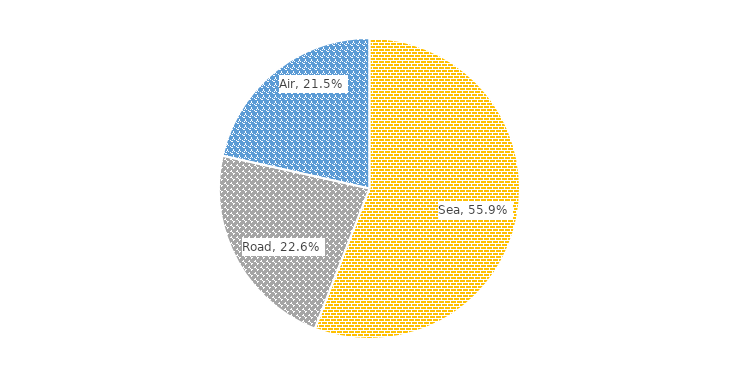
| Category | % share |
|---|---|
| Sea | 0.559 |
| Road | 0.226 |
| Air | 0.215 |